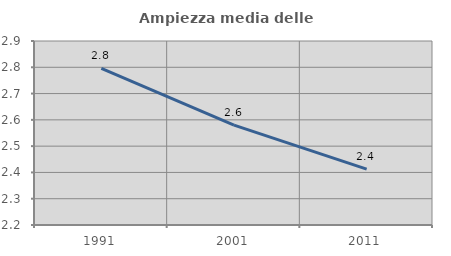
| Category | Ampiezza media delle famiglie |
|---|---|
| 1991.0 | 2.796 |
| 2001.0 | 2.58 |
| 2011.0 | 2.412 |